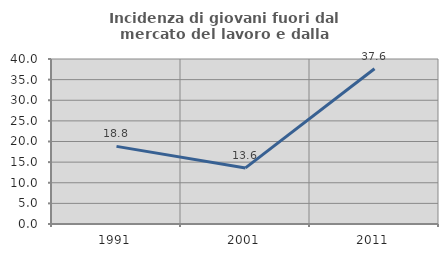
| Category | Incidenza di giovani fuori dal mercato del lavoro e dalla formazione  |
|---|---|
| 1991.0 | 18.817 |
| 2001.0 | 13.6 |
| 2011.0 | 37.634 |